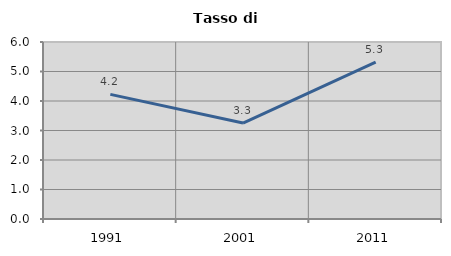
| Category | Tasso di disoccupazione   |
|---|---|
| 1991.0 | 4.225 |
| 2001.0 | 3.252 |
| 2011.0 | 5.319 |